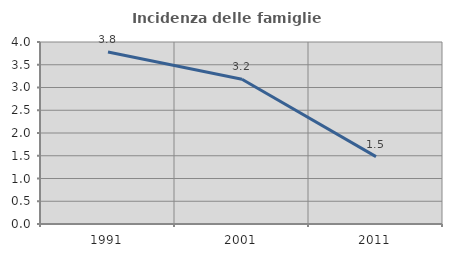
| Category | Incidenza delle famiglie numerose |
|---|---|
| 1991.0 | 3.78 |
| 2001.0 | 3.18 |
| 2011.0 | 1.481 |